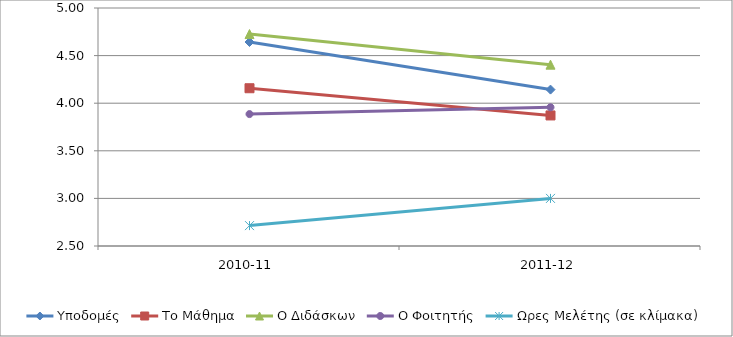
| Category | Υποδομές | Το Μάθημα | Ο Διδάσκων | Ο Φοιτητής | Ωρες Μελέτης (σε κλίμακα) |
|---|---|---|---|---|---|
| 2010-11 | 4.643 | 4.157 | 4.726 | 3.886 | 2.714 |
| 2011-12 | 4.143 | 3.871 | 4.405 | 3.957 | 3 |